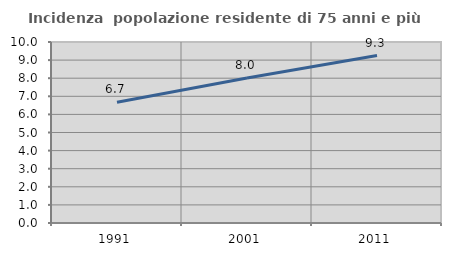
| Category | Incidenza  popolazione residente di 75 anni e più |
|---|---|
| 1991.0 | 6.67 |
| 2001.0 | 8.016 |
| 2011.0 | 9.252 |